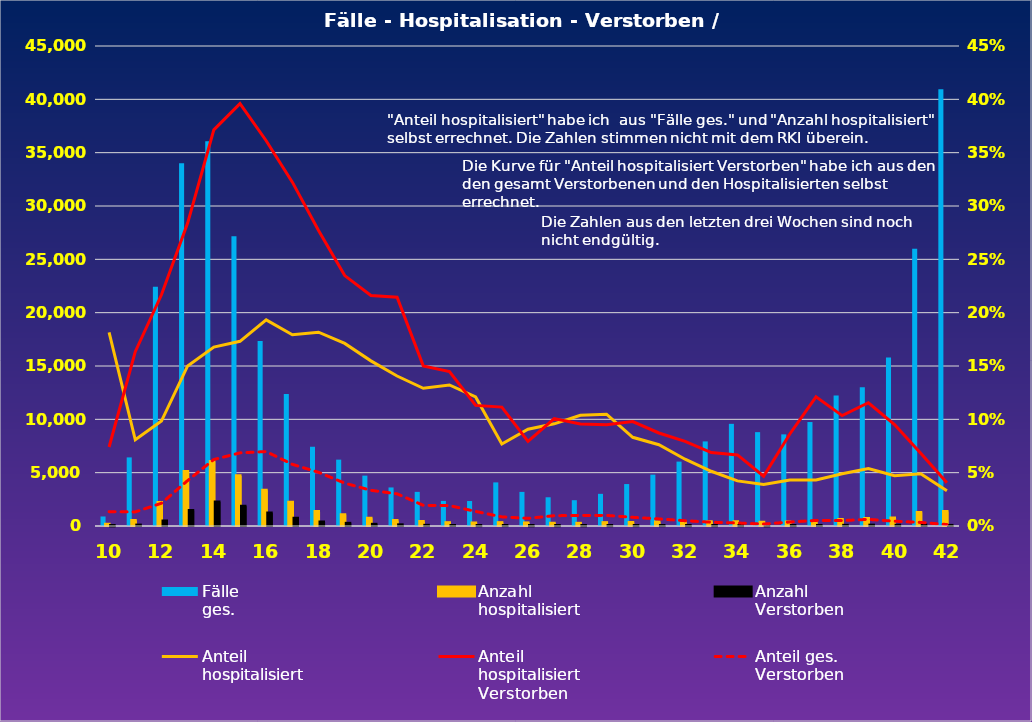
| Category | Fälle
ges. | Anzahl
hospitalisiert | Anzahl
Verstorben |
|---|---|---|---|
| 10.0 | 892 | 162 | 12 |
| 11.0 | 6431 | 520 | 85 |
| 12.0 | 22420 | 2205 | 478 |
| 13.0 | 34016 | 5103 | 1449 |
| 14.0 | 36063 | 6050 | 2247 |
| 15.0 | 27161 | 4703 | 1862 |
| 16.0 | 17337 | 3350 | 1210 |
| 17.0 | 12367 | 2218 | 715 |
| 18.0 | 7429 | 1350 | 374 |
| 19.0 | 6221 | 1065 | 250 |
| 20.0 | 4722 | 731 | 158 |
| 21.0 | 3613 | 508 | 109 |
| 22.0 | 3199 | 413 | 62 |
| 23.0 | 2352 | 311 | 45 |
| 24.0 | 2340 | 283 | 32 |
| 25.0 | 4088 | 314 | 35 |
| 26.0 | 3197 | 290 | 23 |
| 27.0 | 2693 | 258 | 26 |
| 28.0 | 2419 | 251 | 24 |
| 29.0 | 3015 | 316 | 30 |
| 30.0 | 3932 | 327 | 32 |
| 31.0 | 4814 | 367 | 32 |
| 32.0 | 6037 | 378 | 30 |
| 33.0 | 7930 | 407 | 28 |
| 34.0 | 9577 | 405 | 27 |
| 35.0 | 8799 | 343 | 16 |
| 36.0 | 8590 | 371 | 32 |
| 37.0 | 9745 | 421 | 51 |
| 38.0 | 12235 | 599 | 62 |
| 39.0 | 13014 | 701 | 81 |
| 40.0 | 15807 | 746 | 71 |
| 41.0 | 25988 | 1275 | 87 |
| 42.0 | 40934 | 1356 | 55 |